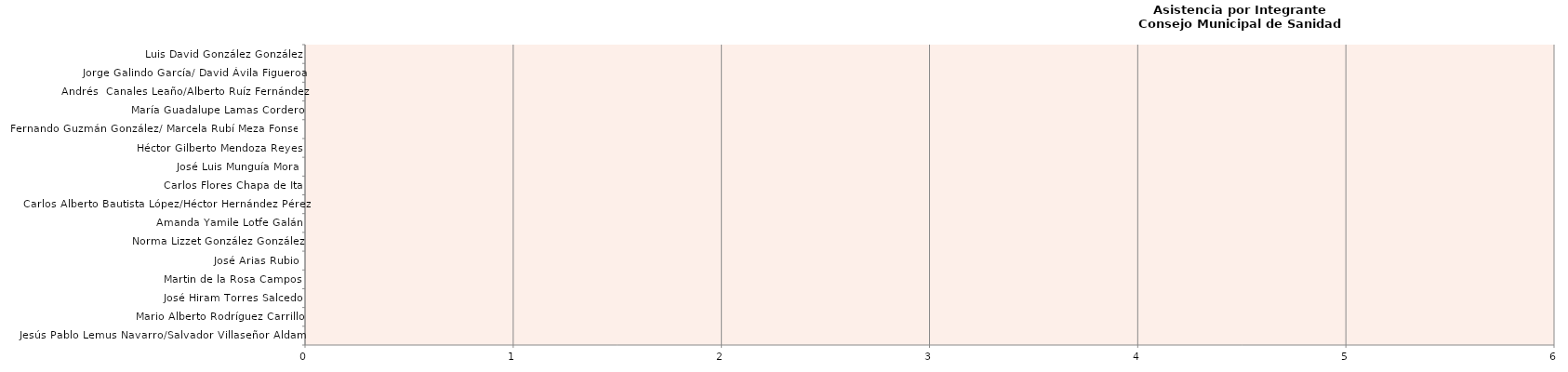
| Category | Series 0 |
|---|---|
| Jesús Pablo Lemus Navarro/Salvador Villaseñor Aldama | 0 |
| Mario Alberto Rodríguez Carrillo | 0 |
| José Hiram Torres Salcedo | 0 |
| Martin de la Rosa Campos | 0 |
| José Arias Rubio | 0 |
| Norma Lizzet González González | 0 |
| Amanda Yamile Lotfe Galán | 0 |
| Carlos Alberto Bautista López/Héctor Hernández Pérez | 0 |
| Carlos Flores Chapa de Ita | 0 |
| José Luis Munguía Mora | 0 |
| Héctor Gilberto Mendoza Reyes | 0 |
| Fernando Guzmán González/ Marcela Rubí Meza Fonseca | 0 |
| María Guadalupe Lamas Cordero | 0 |
| Andrés  Canales Leaño/Alberto Ruíz Fernández | 0 |
| Jorge Galindo García/ David Ávila Figueroa | 0 |
| Luis David González González | 0 |